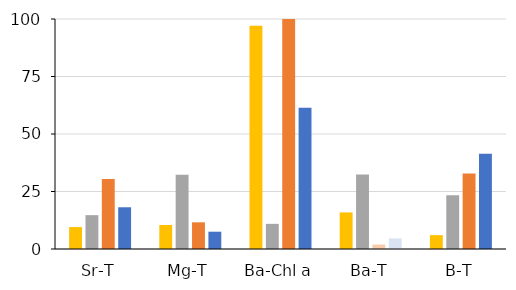
| Category | FO | IOM | ICE | GOM |
|---|---|---|---|---|
| Sr-T | 9.529 | 14.717 | 30.401 | 18.145 |
| Mg-T | 10.448 | 32.268 | 11.597 | 7.522 |
| Ba-Chl a | 97.118 | 10.933 | 100 | 61.395 |
| Ba-T | 15.907 | 32.405 | 1.92 | 4.618 |
| B-T | 6.032 | 23.367 | 32.838 | 41.366 |